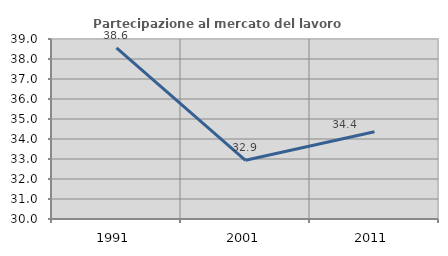
| Category | Partecipazione al mercato del lavoro  femminile |
|---|---|
| 1991.0 | 38.556 |
| 2001.0 | 32.936 |
| 2011.0 | 34.365 |